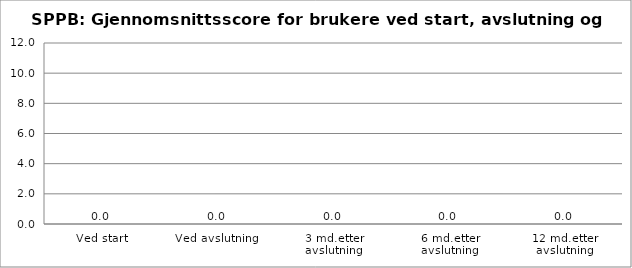
| Category | serie1 |
|---|---|
| Ved start | 0 |
| Ved avslutning | 0 |
| 3 md.etter avslutning | 0 |
| 6 md.etter avslutning | 0 |
| 12 md.etter avslutning | 0 |